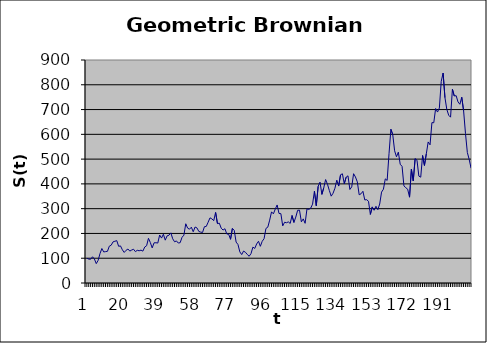
| Category | Series 0 |
|---|---|
| 0 | 100 |
| 1 | 96.474 |
| 2 | 95.973 |
| 3 | 105.9 |
| 4 | 96.895 |
| 5 | 78.161 |
| 6 | 91.137 |
| 7 | 118.515 |
| 8 | 139.187 |
| 9 | 125.282 |
| 10 | 126.654 |
| 11 | 127.816 |
| 12 | 148.509 |
| 13 | 152.516 |
| 14 | 166.057 |
| 15 | 168.448 |
| 16 | 170.97 |
| 17 | 148.097 |
| 18 | 149.697 |
| 19 | 134.021 |
| 20 | 123.401 |
| 21 | 132.062 |
| 22 | 137.125 |
| 23 | 128.815 |
| 24 | 133.012 |
| 25 | 136.246 |
| 26 | 126.526 |
| 27 | 131.933 |
| 28 | 130.08 |
| 29 | 132.729 |
| 30 | 128.632 |
| 31 | 145.23 |
| 32 | 150.405 |
| 33 | 180.384 |
| 34 | 163.314 |
| 35 | 141.636 |
| 36 | 162.196 |
| 37 | 162.474 |
| 38 | 161.225 |
| 39 | 193.742 |
| 40 | 181.274 |
| 41 | 196.786 |
| 42 | 172.855 |
| 43 | 190.333 |
| 44 | 192.895 |
| 45 | 202.236 |
| 46 | 178.409 |
| 47 | 166.3 |
| 48 | 169.715 |
| 49 | 161.241 |
| 50 | 162.721 |
| 51 | 184.401 |
| 52 | 193.12 |
| 53 | 239.064 |
| 54 | 221.468 |
| 55 | 217.153 |
| 56 | 225.275 |
| 57 | 206.793 |
| 58 | 225.964 |
| 59 | 222.293 |
| 60 | 208.126 |
| 61 | 205.327 |
| 62 | 203.982 |
| 63 | 227.086 |
| 64 | 228.384 |
| 65 | 245.358 |
| 66 | 263.051 |
| 67 | 258.76 |
| 68 | 251.586 |
| 69 | 284.685 |
| 70 | 239.817 |
| 71 | 241.38 |
| 72 | 221.176 |
| 73 | 213.683 |
| 74 | 219.054 |
| 75 | 197.793 |
| 76 | 196.939 |
| 77 | 176.349 |
| 78 | 220.224 |
| 79 | 212.52 |
| 80 | 165.107 |
| 81 | 155.266 |
| 82 | 125.53 |
| 83 | 114.763 |
| 84 | 128.877 |
| 85 | 123.997 |
| 86 | 115.054 |
| 87 | 107.93 |
| 88 | 118.714 |
| 89 | 144.912 |
| 90 | 139.462 |
| 91 | 157.339 |
| 92 | 168.466 |
| 93 | 148.119 |
| 94 | 168.293 |
| 95 | 179.073 |
| 96 | 220.212 |
| 97 | 225.319 |
| 98 | 253.722 |
| 99 | 287.134 |
| 100 | 278.995 |
| 101 | 298.302 |
| 102 | 314.987 |
| 103 | 280.595 |
| 104 | 279.934 |
| 105 | 230.536 |
| 106 | 245.257 |
| 107 | 243.269 |
| 108 | 246.603 |
| 109 | 240.418 |
| 110 | 272.503 |
| 111 | 244.347 |
| 112 | 266.173 |
| 113 | 293.45 |
| 114 | 293.902 |
| 115 | 246.767 |
| 116 | 258.745 |
| 117 | 240.948 |
| 118 | 299.085 |
| 119 | 297.105 |
| 120 | 301.855 |
| 121 | 318.292 |
| 122 | 370.352 |
| 123 | 311.977 |
| 124 | 390.192 |
| 125 | 407.248 |
| 126 | 357.603 |
| 127 | 384.293 |
| 128 | 417.488 |
| 129 | 398.495 |
| 130 | 373.192 |
| 131 | 350.481 |
| 132 | 362.296 |
| 133 | 382.681 |
| 134 | 415.005 |
| 135 | 391.264 |
| 136 | 436.512 |
| 137 | 440.854 |
| 138 | 400.656 |
| 139 | 426.954 |
| 140 | 432.628 |
| 141 | 377.464 |
| 142 | 387.985 |
| 143 | 441.084 |
| 144 | 427.89 |
| 145 | 408.134 |
| 146 | 356.068 |
| 147 | 360.092 |
| 148 | 370.106 |
| 149 | 335.233 |
| 150 | 336.241 |
| 151 | 329.786 |
| 152 | 276.817 |
| 153 | 307.117 |
| 154 | 293.496 |
| 155 | 309.685 |
| 156 | 295.887 |
| 157 | 318.761 |
| 158 | 366.807 |
| 159 | 378.613 |
| 160 | 420.263 |
| 161 | 413.955 |
| 162 | 521.861 |
| 163 | 620.552 |
| 164 | 598.947 |
| 165 | 533.58 |
| 166 | 509.433 |
| 167 | 528.058 |
| 168 | 479.305 |
| 169 | 470.669 |
| 170 | 391.83 |
| 171 | 384.602 |
| 172 | 378.504 |
| 173 | 346.359 |
| 174 | 459.42 |
| 175 | 412.106 |
| 176 | 501.879 |
| 177 | 495.63 |
| 178 | 431.439 |
| 179 | 427.074 |
| 180 | 514.59 |
| 181 | 474.38 |
| 182 | 521.51 |
| 183 | 569.351 |
| 184 | 557.654 |
| 185 | 647.273 |
| 186 | 646.772 |
| 187 | 704.262 |
| 188 | 689.902 |
| 189 | 706.349 |
| 190 | 813.555 |
| 191 | 847.488 |
| 192 | 747.876 |
| 193 | 700.615 |
| 194 | 677.059 |
| 195 | 669.324 |
| 196 | 782.144 |
| 197 | 754.606 |
| 198 | 755.99 |
| 199 | 730.813 |
| 200 | 721.302 |
| 201 | 749.812 |
| 202 | 695.214 |
| 203 | 603.795 |
| 204 | 526.993 |
| 205 | 498.542 |
| 206 | 463.295 |